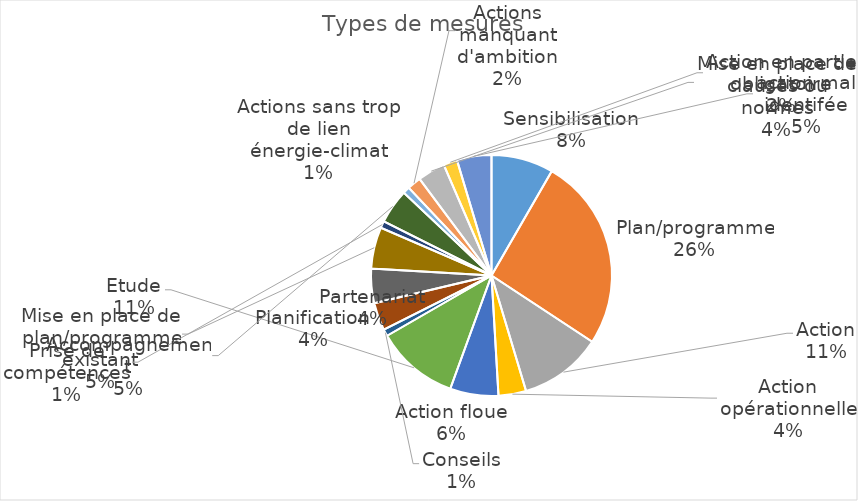
| Category | Series 0 |
|---|---|
| Sensibilisation | 0.083 |
| Plan/programme | 0.259 |
| Action | 0.111 |
| Action opérationnelle | 0.037 |
| Action floue | 0.065 |
| Etude | 0.111 |
| Conseils | 0.009 |
| Planification | 0.037 |
| Partenariat | 0.046 |
| Mise en place de plan/programme existant | 0.056 |
| Prise de compétences | 0.009 |
| Accompagnement | 0.046 |
| Actions sans trop de lien énergie-climat | 0.009 |
| Actions manquant d'ambition | 0.019 |
| Mise en place de clauses ou normes | 0.037 |
| Action en partie obligatoire | 0.019 |
| action mal identifée | 0.046 |